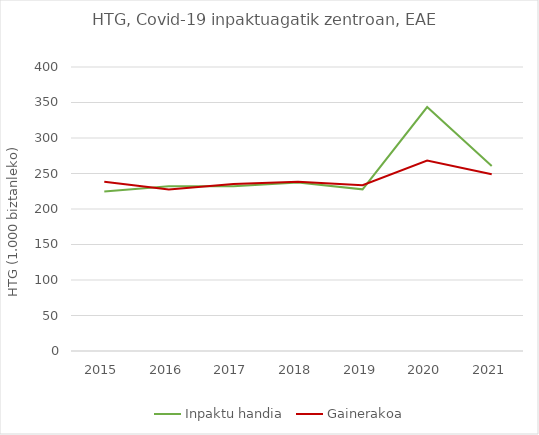
| Category | Inpaktu handia | Gainerakoa |
|---|---|---|
| 2015.0 | 224.686 | 238.282 |
| 2016.0 | 232.13 | 227.303 |
| 2017.0 | 232.106 | 235.244 |
| 2018.0 | 237.415 | 238.351 |
| 2019.0 | 227.66 | 233.529 |
| 2020.0 | 343.648 | 268.26 |
| 2021.0 | 260.495 | 249.057 |